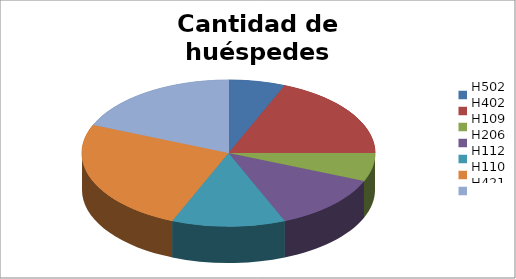
| Category | Cantidad de
huéspedes |
|---|---|
| H502 | 1 |
| H402 | 3 |
| H109 | 1 |
| H206 | 2 |
| H112 | 2 |
| H110 | 4 |
| H421 | 3 |